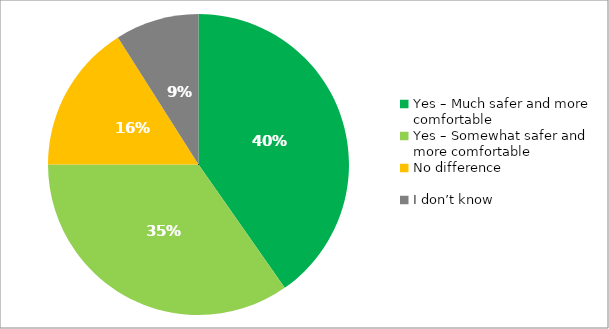
| Category | Responses |
|---|---|
| Yes – Much safer and more comfortable | 0.403 |
| Yes – Somewhat safer and more comfortable | 0.347 |
| No difference | 0.16 |
| I don’t know | 0.09 |